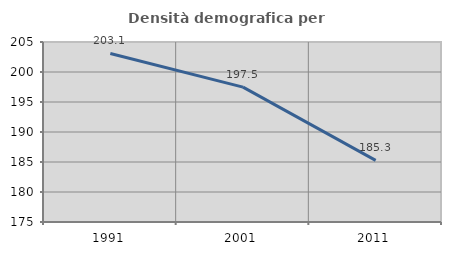
| Category | Densità demografica |
|---|---|
| 1991.0 | 203.087 |
| 2001.0 | 197.477 |
| 2011.0 | 185.268 |